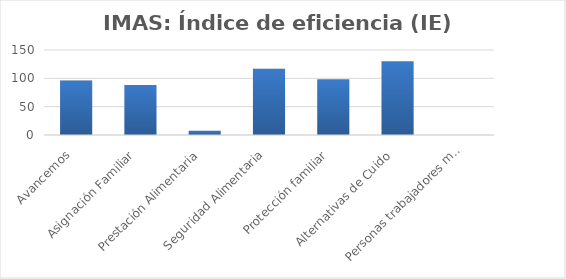
| Category | Índice de eficiencia (IE)  |
|---|---|
| Avancemos | 96.126 |
| Asignación Familiar | 88.287 |
| Prestación Alimentaria | 7.39 |
| Seguridad Alimentaria | 116.838 |
| Protección familiar | 98.574 |
| Alternativas de Cuido | 130.22 |
| Personas trabajadores menores de edad | 0 |